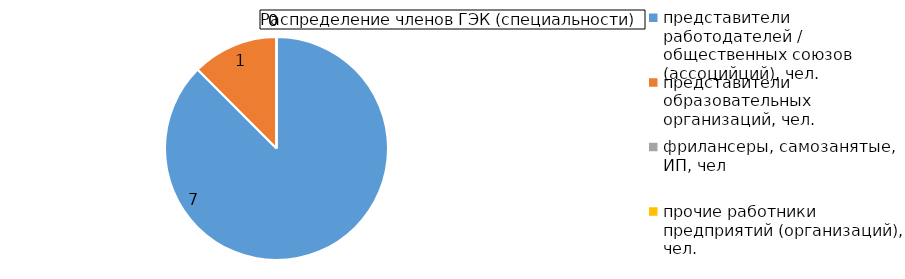
| Category | Series 1 |
|---|---|
| представители работодателей / общественных союзов (ассоцийций), чел. | 7 |
| представители образовательных организаций, чел. | 1 |
| фрилансеры, самозанятые, ИП, чел | 0 |
| прочие работники предприятий (организаций), чел. | 0 |